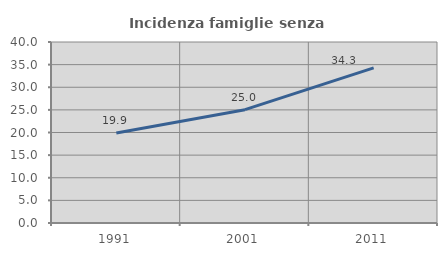
| Category | Incidenza famiglie senza nuclei |
|---|---|
| 1991.0 | 19.869 |
| 2001.0 | 25.041 |
| 2011.0 | 34.298 |